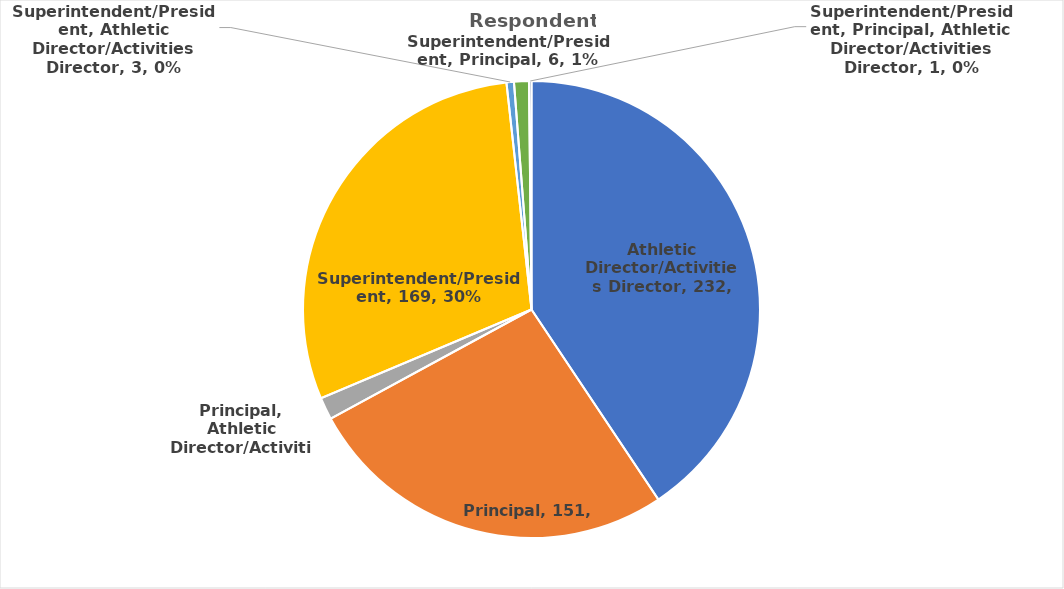
| Category | Series 0 |
|---|---|
| Athletic Director/Activities Director | 232 |
| Principal | 151 |
| Principal, Athletic Director/Activities Director | 9 |
| Superintendent/President | 169 |
| Superintendent/President, Athletic Director/Activities Director | 3 |
| Superintendent/President, Principal | 6 |
| Superintendent/President, Principal, Athletic Director/Activities Director | 1 |